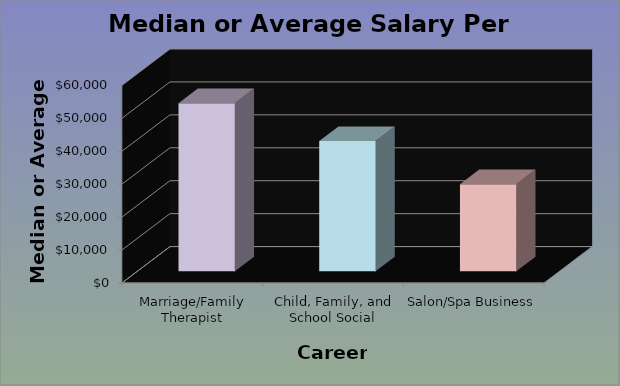
| Category | Average Salary |
|---|---|
| Marriage/Family Therapist | 51050 |
| Child, Family, and School Social Workers | 39530 |
| Salon/Spa Business | 26460 |